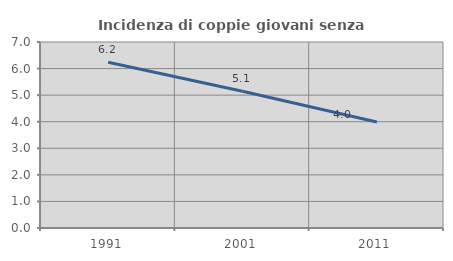
| Category | Incidenza di coppie giovani senza figli |
|---|---|
| 1991.0 | 6.237 |
| 2001.0 | 5.145 |
| 2011.0 | 3.991 |